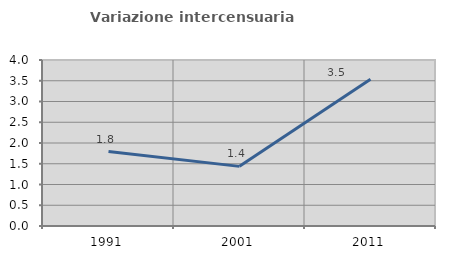
| Category | Variazione intercensuaria annua |
|---|---|
| 1991.0 | 1.794 |
| 2001.0 | 1.437 |
| 2011.0 | 3.535 |